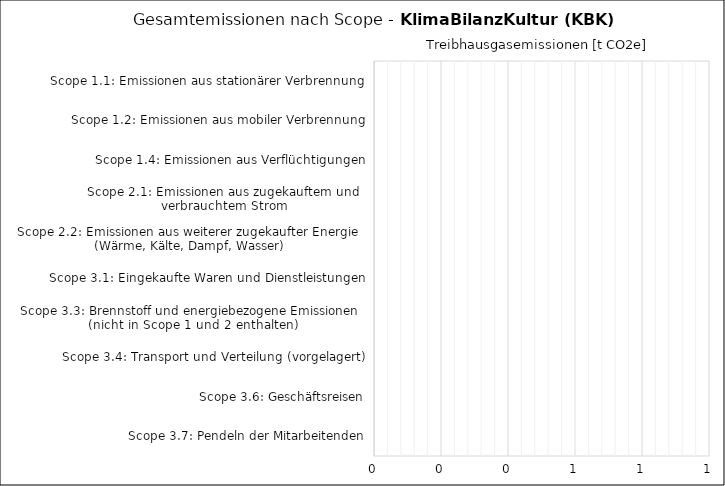
| Category | Series 0 |
|---|---|
| Scope 1.1: Emissionen aus stationärer Verbrennung | 0 |
| Scope 1.2: Emissionen aus mobiler Verbrennung | 0 |
| Scope 1.4: Emissionen aus Verflüchtigungen | 0 |
| Scope 2.1: Emissionen aus zugekauftem und 
verbrauchtem Strom | 0 |
| Scope 2.2: Emissionen aus weiterer zugekaufter Energie 
(Wärme, Kälte, Dampf, Wasser) | 0 |
| Scope 3.1: Eingekaufte Waren und Dienstleistungen | 0 |
| Scope 3.3: Brennstoff und energiebezogene Emissionen 
(nicht in Scope 1 und 2 enthalten) | 0 |
| Scope 3.4: Transport und Verteilung (vorgelagert) | 0 |
| Scope 3.6: Geschäftsreisen | 0 |
| Scope 3.7: Pendeln der Mitarbeitenden | 0 |